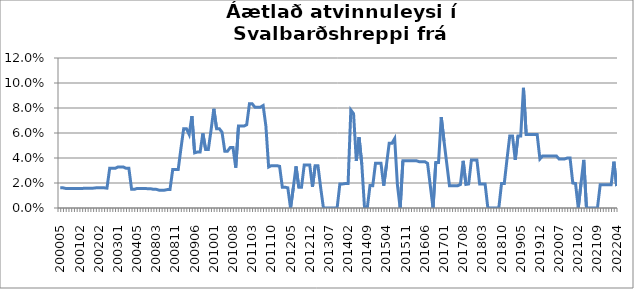
| Category | Series 0 |
|---|---|
| 200005 | 0.016 |
| 200006 | 0.016 |
| 200008 | 0.016 |
| 200009 | 0.016 |
| 200010 | 0.016 |
| 200012 | 0.016 |
| 200101 | 0.016 |
| 200102 | 0.016 |
| 200106 | 0.016 |
| 200107 | 0.016 |
| 200108 | 0.016 |
| 200111 | 0.016 |
| 200112 | 0.016 |
| 200201 | 0.016 |
| 200202 | 0.016 |
| 200203 | 0.016 |
| 200204 | 0.016 |
| 200209 | 0.016 |
| 200210 | 0.032 |
| 200211 | 0.032 |
| 200212 | 0.032 |
| 200301 | 0.033 |
| 200302 | 0.033 |
| 200303 | 0.033 |
| 200304 | 0.032 |
| 200305 | 0.032 |
| 200308 | 0.015 |
| 200309 | 0.015 |
| 200405 | 0.016 |
| 200406 | 0.016 |
| 200407 | 0.016 |
| 200512 | 0.016 |
| 200610 | 0.015 |
| 200611 | 0.015 |
| 200802 | 0.015 |
| 200803 | 0.015 |
| 200804 | 0.014 |
| 200805 | 0.014 |
| 200806 | 0.014 |
| 200808 | 0.015 |
| 200809 | 0.015 |
| 200810 | 0.031 |
| 200811 | 0.031 |
| 200812 | 0.031 |
| 200901 | 0.048 |
| 200902 | 0.063 |
| 200903 | 0.063 |
| 200904 | 0.059 |
| 200905 | 0.074 |
| 200906 | 0.044 |
| 200907 | 0.045 |
| 200908 | 0.045 |
| 200909 | 0.06 |
| 200910 | 0.047 |
| 200911 | 0.047 |
| 200912 | 0.062 |
| 201001 | 0.079 |
| 201002 | 0.063 |
| 201003 | 0.063 |
| 201004 | 0.061 |
| 201005 | 0.045 |
| 201006 | 0.045 |
| 201007 | 0.048 |
| 201008 | 0.048 |
| 201009 | 0.032 |
| 201010 | 0.066 |
| 201011 | 0.066 |
| 201012 | 0.066 |
| 201101 | 0.067 |
| 201102 | 0.083 |
| 201103 | 0.083 |
| 201104 | 0.081 |
| 201105 | 0.081 |
| 201106 | 0.081 |
| 201107 | 0.082 |
| 201108 | 0.066 |
| 201109 | 0.033 |
| 201110 | 0.034 |
| 201111 | 0.034 |
| 201112 | 0.034 |
| 201201 | 0.033 |
| 201202 | 0.017 |
| 201203 | 0.017 |
| 201204 | 0.016 |
| 201205 | 0 |
| 201206 | 0.016 |
| 201207 | 0.033 |
| 201208 | 0.017 |
| 201209 | 0.017 |
| 201210 | 0.034 |
| 201211 | 0.034 |
| 201212 | 0.034 |
| 201301 | 0.017 |
| 201302 | 0.034 |
| 201303 | 0.034 |
| 201304 | 0.016 |
| 201305 | 0 |
| 201306 | 0 |
| 201307 | 0 |
| 201308 | 0 |
| 201309 | 0 |
| 201310 | 0 |
| 201311 | 0.019 |
| 201312 | 0.019 |
| 201401 | 0.02 |
| 201402 | 0.02 |
| 201403 | 0.078 |
| 201404 | 0.075 |
| 201405 | 0.038 |
| 201406 | 0.057 |
| 201407 | 0.035 |
| 201408 | 0 |
| 201409 | 0 |
| 201410 | 0.018 |
| 201411 | 0.018 |
| 201412 | 0.036 |
| 201501 | 0.036 |
| 201502 | 0.036 |
| 201503 | 0.018 |
| 201504 | 0.034 |
| 201505 | 0.052 |
| 201506 | 0.052 |
| 201507 | 0.056 |
| 201508 | 0.019 |
| 201509 | 0 |
| 201510 | 0.038 |
| 201511 | 0.038 |
| 201512 | 0.038 |
| 201601 | 0.038 |
| 201602 | 0.038 |
| 201603 | 0.038 |
| 201604 | 0.037 |
| 201605 | 0.037 |
| 201606 | 0.037 |
| 201607 | 0.036 |
| 201608 | 0.018 |
| 201609 | 0 |
| 201610 | 0.036 |
| 201611 | 0.036 |
| 201612 | 0.073 |
| 201701 | 0.054 |
| 201702 | 0.036 |
| 201703 | 0.018 |
| 201704 | 0.018 |
| 201705 | 0.018 |
| 201706 | 0.018 |
| 201707 | 0.019 |
| 201708 | 0.038 |
| 201709 | 0.019 |
| 201710 | 0.019 |
| 201711 | 0.038 |
| 201712 | 0.038 |
| 201801 | 0.038 |
| 201802 | 0.019 |
| 201803 | 0.019 |
| 201804 | 0.019 |
| 201805 | 0 |
| 201806 | 0 |
| 201807 | 0 |
| 201808 | 0 |
| 201809 | 0 |
| 201810 | 0.02 |
| 201811 | 0.02 |
| 201812 | 0.039 |
| 201901 | 0.058 |
| 201902 | 0.058 |
| 201903 | 0.038 |
| 201904 | 0.058 |
| 201905 | 0.058 |
| 201906 | 0.096 |
| 201907 | 0.059 |
| 201908 | 0.059 |
| 201909 | 0.059 |
| 201910 | 0.059 |
| 201911 | 0.059 |
| 201912 | 0.039 |
| 202001 | 0.042 |
| 202002 | 0.042 |
| 202003 | 0.042 |
| 202004 | 0.042 |
| 202005 | 0.042 |
| 202006 | 0.042 |
| 202007 | 0.039 |
| 202008 | 0.039 |
| 202009 | 0.039 |
| 202010 | 0.04 |
| 202011 | 0.04 |
| 202012 | 0.02 |
| 202101 | 0.02 |
| 202102 | 0 |
| 202103 | 0.02 |
| 202104 | 0.038 |
| 202105 | 0 |
| 202106 | 0 |
| 202107 | 0 |
| 202108 | 0 |
| 202109 | 0 |
| 202110 | 0.019 |
| 202111 | 0.019 |
| 202112 | 0.019 |
| 202201 | 0.019 |
| 202202 | 0.019 |
| 202203 | 0.037 |
| 202204 | 0.018 |